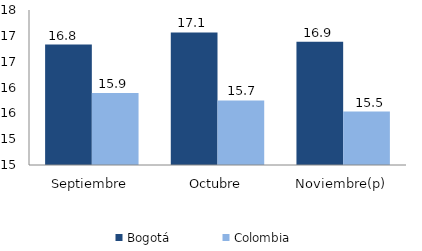
| Category | Bogotá | Colombia |
|---|---|---|
| Septiembre | 16.831 | 15.893 |
| Octubre | 17.065 | 15.749 |
| Noviembre(p) | 16.884 | 15.534 |